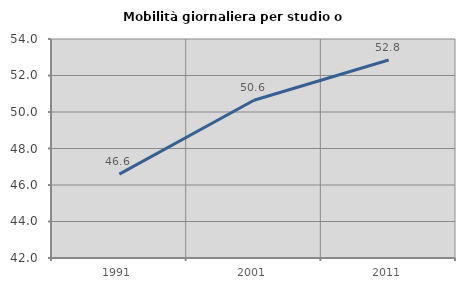
| Category | Mobilità giornaliera per studio o lavoro |
|---|---|
| 1991.0 | 46.598 |
| 2001.0 | 50.646 |
| 2011.0 | 52.846 |